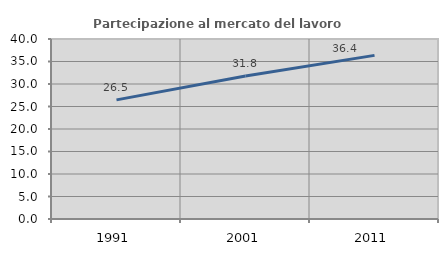
| Category | Partecipazione al mercato del lavoro  femminile |
|---|---|
| 1991.0 | 26.473 |
| 2001.0 | 31.764 |
| 2011.0 | 36.364 |